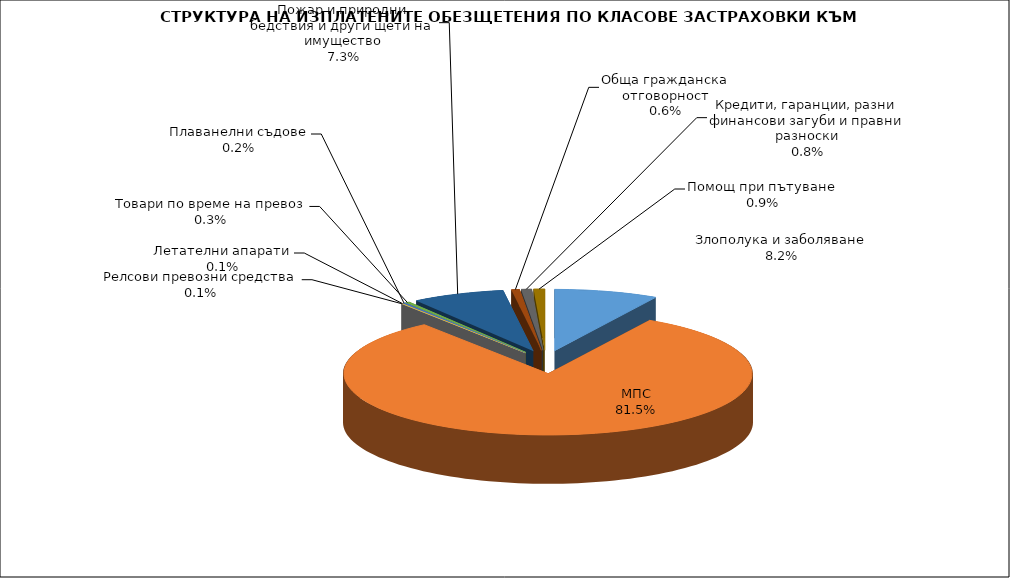
| Category | Злополука и заболяване |
|---|---|
| Злополука и заболяване | 0.082 |
| МПС | 0.815 |
| Релсови превозни средства | 0.001 |
| Летателни апарати | 0.001 |
| Плаванелни съдове | 0.002 |
| Товари по време на превоз | 0.003 |
| Пожар и природни бедствия и други щети на имущество | 0.073 |
| Обща гражданска отговорност | 0.006 |
| Кредити, гаранции, разни финансови загуби и правни разноски | 0.008 |
| Помощ при пътуване | 0.009 |